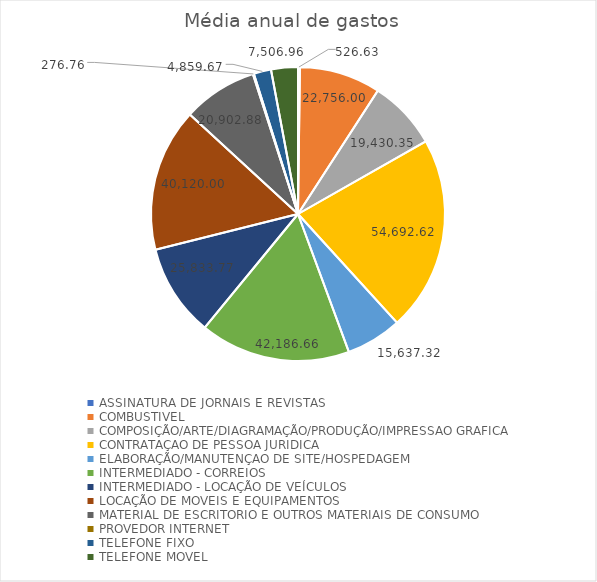
| Category | Series 0 |
|---|---|
| ASSINATURA DE JORNAIS E REVISTAS | 526.633 |
| COMBUSTIVEL | 22756.003 |
| COMPOSIÇÃO/ARTE/DIAGRAMAÇÃO/PRODUÇÃO/IMPRESSAO GRAFICA | 19430.35 |
| CONTRATAÇAO DE PESSOA JURIDICA | 54692.623 |
| ELABORAÇÃO/MANUTENÇAO DE SITE/HOSPEDAGEM | 15637.323 |
| INTERMEDIADO - CORREIOS | 42186.66 |
| INTERMEDIADO - LOCAÇÃO DE VEÍCULOS | 25833.77 |
| LOCAÇÃO DE MOVEIS E EQUIPAMENTOS | 40120 |
| MATERIAL DE ESCRITORIO E OUTROS MATERIAIS DE CONSUMO | 20902.883 |
| PROVEDOR INTERNET | 276.76 |
| TELEFONE FIXO | 4859.67 |
| TELEFONE MOVEL | 7506.96 |